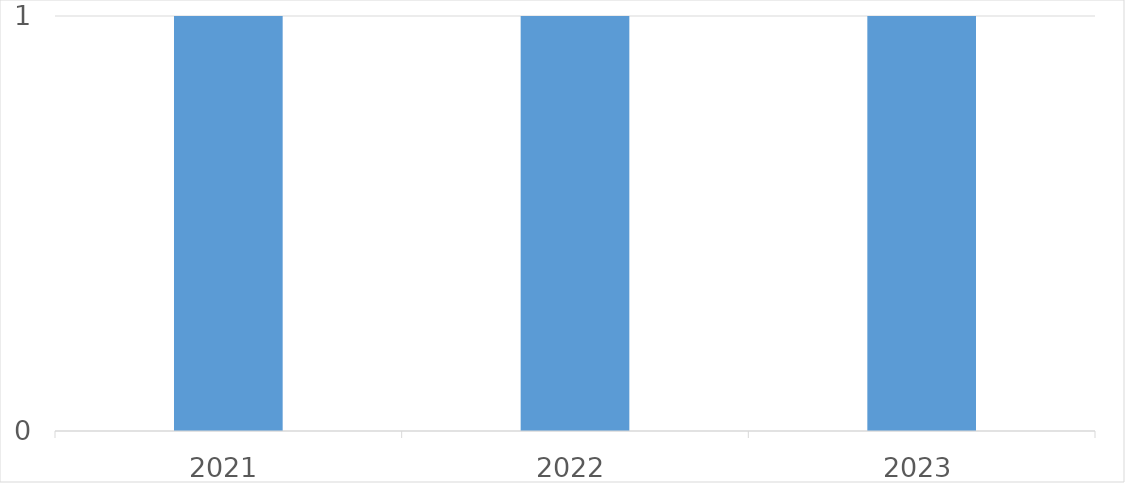
| Category | Series 0 |
|---|---|
| 2021 | 1 |
| 2022 | 1 |
| 2023 | 1 |